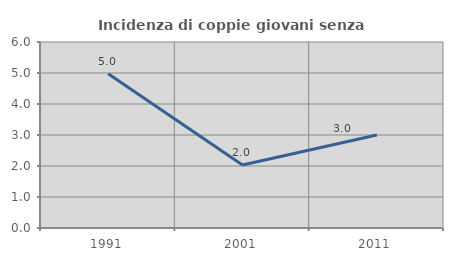
| Category | Incidenza di coppie giovani senza figli |
|---|---|
| 1991.0 | 4.978 |
| 2001.0 | 2.035 |
| 2011.0 | 3 |